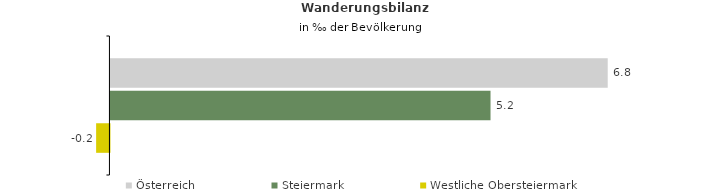
| Category | Österreich | Steiermark | Westliche Obersteiermark |
|---|---|---|---|
| Wanderungsrate in ‰ der Bevölkerung, Periode 2015-2019 | 6.771 | 5.175 | -0.181 |